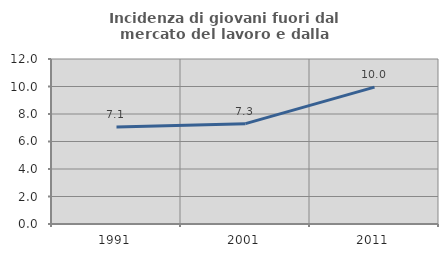
| Category | Incidenza di giovani fuori dal mercato del lavoro e dalla formazione  |
|---|---|
| 1991.0 | 7.059 |
| 2001.0 | 7.298 |
| 2011.0 | 9.957 |